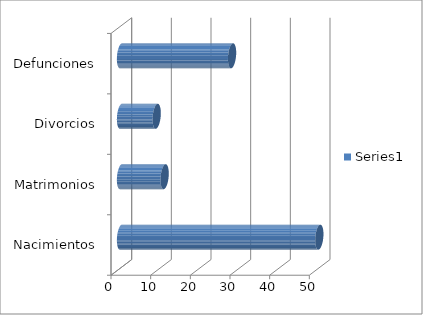
| Category | Series 0 |
|---|---|
| Nacimientos | 50 |
| Matrimonios | 11 |
| Divorcios | 9 |
| Defunciones | 28 |